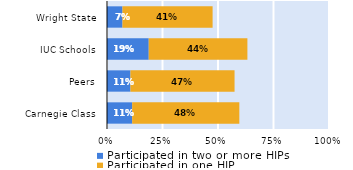
| Category | Participated in two or more HIPs | Participated in one HIP |
|---|---|---|
| Carnegie Class | 0.113 | 0.483 |
| Peers | 0.106 | 0.469 |
| IUC Schools | 0.188 | 0.444 |
| Wright State | 0.07 | 0.406 |